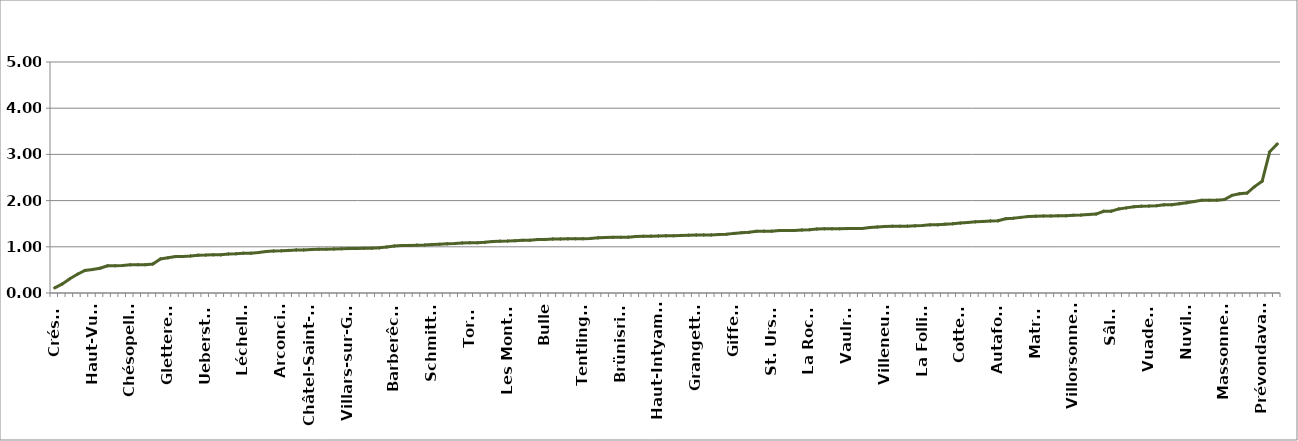
| Category | moyenne
2011-2012 |
|---|---|
| Crésuz | 0.112 |
| Greng | 0.197 |
| Ferpicloz | 0.311 |
| Siviriez | 0.405 |
| Cressier | 0.489 |
| Haut-Vully | 0.508 |
| Muntelier | 0.536 |
| Châtillon | 0.591 |
| Cheyres | 0.591 |
| Kleinbösingen | 0.594 |
| Chésopelloz | 0.611 |
| Pierrafortscha | 0.612 |
| Delley-Portalban | 0.613 |
| Châtel-sur-Montsalvens | 0.629 |
| Granges-Paccot | 0.737 |
| Gletterens | 0.762 |
| Galmiz | 0.789 |
| Givisiez | 0.79 |
| Rueyres-les-Prés | 0.802 |
| Rechthalten | 0.819 |
| Ueberstorf | 0.82 |
| Courlevon | 0.825 |
| Avry | 0.826 |
| Val-de-Charmey | 0.843 |
| Düdingen | 0.849 |
| Léchelles | 0.862 |
| Montet (Glâne) | 0.862 |
| Corminboeuf | 0.876 |
| Plasselb | 0.897 |
| Vuissens | 0.909 |
| Arconciel | 0.912 |
| Auboranges | 0.922 |
| Bussy | 0.932 |
| Ried bei Kerzers | 0.933 |
| Sorens | 0.94 |
| Châtel-Saint-Denis | 0.945 |
| Hauteville | 0.947 |
| Bas-Vully | 0.952 |
| Corbières | 0.957 |
| Semsales | 0.962 |
| Villars-sur-Glâne | 0.965 |
| Grandvillard | 0.967 |
| Morlon | 0.97 |
| Pont-en-Ogoz | 0.977 |
| Bas-Intyamon | 0.995 |
| Barberêche | 1.017 |
| St. Antoni | 1.027 |
| Plaffeien | 1.029 |
| Riaz | 1.036 |
| Botterens | 1.038 |
| Schmitten | 1.048 |
| Neyruz | 1.054 |
| Wallenried | 1.064 |
| Chapelle (Glâne) | 1.07 |
| Corserey | 1.083 |
| Torny | 1.087 |
| Châbles | 1.087 |
| Courgevaux | 1.097 |
| Rue | 1.113 |
| Senèdes | 1.121 |
| Les Montets | 1.123 |
| Tafers | 1.132 |
| Villarepos | 1.139 |
| La Brillaz | 1.142 |
| Meyriez | 1.157 |
| Bulle | 1.16 |
| Saint-Aubin | 1.168 |
| Salvenach | 1.171 |
| Murten | 1.172 |
| Echarlens | 1.174 |
| Tentlingen | 1.174 |
| Alterswil | 1.181 |
| Gruyères | 1.194 |
| Cugy | 1.202 |
| Marly | 1.204 |
| Brünisried | 1.205 |
| Hauterive | 1.209 |
| Pont-la-Ville | 1.224 |
| Bösingen | 1.226 |
| St. Silvester | 1.231 |
| Haut-Intyamon | 1.235 |
| Misery-Courtion | 1.238 |
| Rossens | 1.238 |
| Prez-vers-Noréaz | 1.247 |
| Ponthaux | 1.251 |
| Grangettes | 1.253 |
| Russy | 1.256 |
| Corpataux-Magnedens | 1.257 |
| Heitenried | 1.265 |
| Wünnewil-Flamatt | 1.269 |
| Giffers | 1.29 |
| Gurmels | 1.306 |
| Autigny | 1.314 |
| Le Glèbe | 1.335 |
| Fribourg | 1.338 |
| St. Ursen | 1.338 |
| Granges | 1.351 |
| Kerzers | 1.352 |
| La Sonnaz | 1.353 |
| Fräschels | 1.363 |
| La Roche | 1.369 |
| Ependes | 1.385 |
| Vallon | 1.39 |
| Morens | 1.39 |
| Remaufens | 1.391 |
| Vaulruz | 1.394 |
| Villaz-Saint-Pierre | 1.396 |
| Belfaux | 1.396 |
| Domdidier | 1.417 |
| Gempenach | 1.428 |
| Villeneuve | 1.441 |
| Dompierre | 1.444 |
| Le Mouret | 1.445 |
| Attalens | 1.447 |
| Lully | 1.453 |
| La Folliaz | 1.461 |
| Noréaz | 1.475 |
| Montagny | 1.476 |
| Broc | 1.49 |
| Lurtigen | 1.498 |
| Cottens | 1.514 |
| Bossonnens | 1.526 |
| Sévaz | 1.541 |
| Grolley | 1.549 |
| Estavayer-le-Lac | 1.559 |
| Autafond | 1.563 |
| Romont | 1.609 |
| Murist | 1.617 |
| Ursy | 1.637 |
| Chénens | 1.655 |
| Matran | 1.662 |
| Surpierre | 1.666 |
| Ecublens | 1.668 |
| Ménières | 1.671 |
| Ulmiz | 1.671 |
| Villorsonnens | 1.683 |
| Fétigny | 1.687 |
| La Verrerie | 1.697 |
| Vuisternens-en-Ogoz | 1.709 |
| Le Pâquier | 1.769 |
| Sâles | 1.772 |
| Farvagny | 1.82 |
| Jeuss | 1.843 |
| Saint-Martin | 1.868 |
| Cheiry | 1.879 |
| Vuadens | 1.882 |
| Treyvaux | 1.89 |
| Vernay | 1.908 |
| Vuisternens-devant-Romont | 1.91 |
| Le Châtelard | 1.932 |
| Nuvilly | 1.954 |
| Villarsel-sur-Marly | 1.979 |
| Courtepin | 2.006 |
| Marsens | 2.007 |
| Le Flon | 2.01 |
| Massonnens | 2.024 |
| Mézières | 2.113 |
| Châtonnaye | 2.149 |
| Jaun | 2.162 |
| Oberschrot | 2.302 |
| Prévondavaux | 2.418 |
| Zumholz | 3.056 |
| Billens-Hennens | 3.225 |